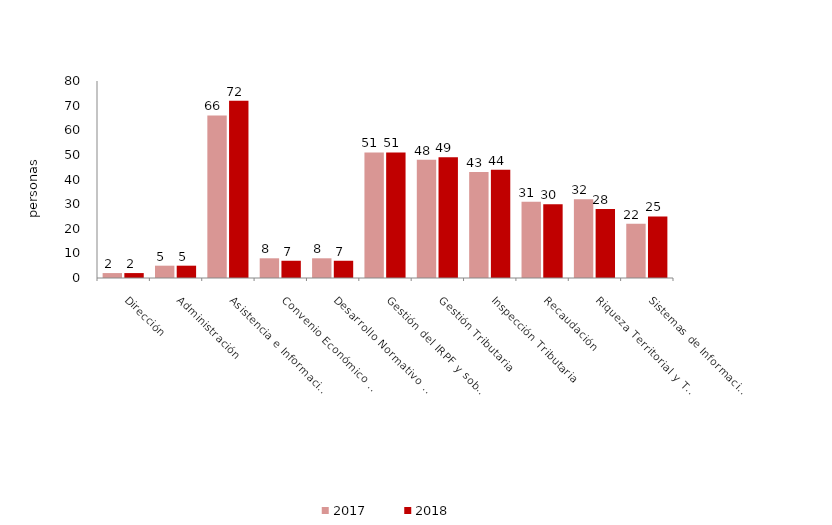
| Category | 2017 | 2018 |
|---|---|---|
| Dirección | 2 | 2 |
| Administración | 5 | 5 |
| Asistencia e Información al Contribuyente | 66 | 72 |
| Convenio Económico y Planificación Financiera | 8 | 7 |
| Desarrollo Normativo y Asesoramiento Jurídico | 8 | 7 |
| Gestión del IRPF y sobre el Patrimonio | 51 | 51 |
| Gestión Tributaria | 48 | 49 |
| Inspección Tributaria | 43 | 44 |
| Recaudación | 31 | 30 |
| Riqueza Territorial y Tributos Patrimoniales | 32 | 28 |
| Sistemas de Información Tributaria | 22 | 25 |